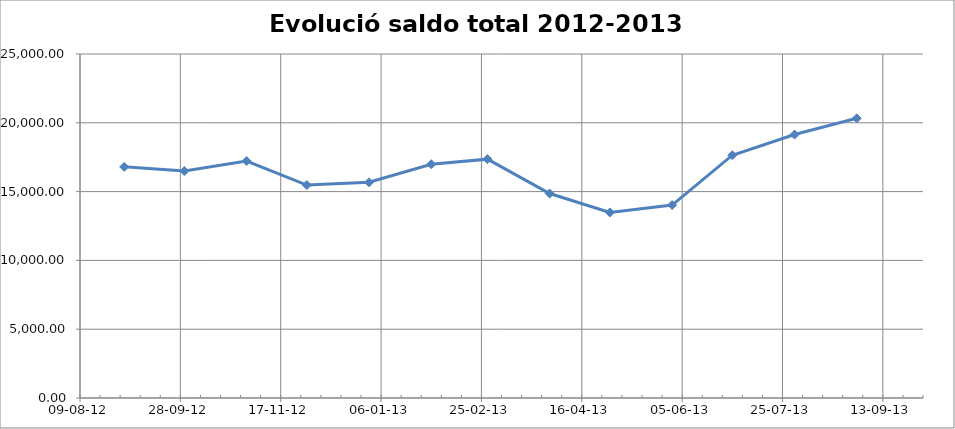
| Category | total € |
|---|---|
| 41152.0 | 16797.86 |
| 41182.0 | 16495.87 |
| 41213.0 | 17221.88 |
| 41243.0 | 15477.16 |
| 41274.0 | 15676.6 |
| 41305.0 | 16989.48 |
| 41333.0 | 17358.89 |
| 41364.0 | 14859.79 |
| 41394.0 | 13486.75 |
| 41425.0 | 14023.72 |
| 41455.0 | 17644.35 |
| 41486.0 | 19148.33 |
| 41517.0 | 20328.8 |